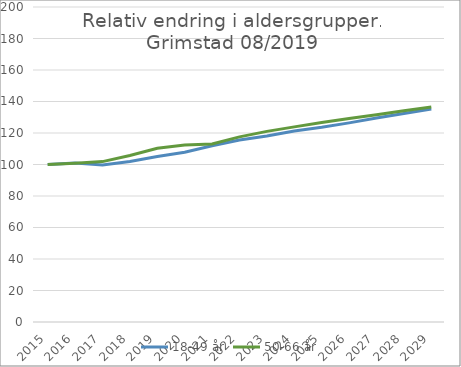
| Category | 18-49 år | 50-66 år |
|---|---|---|
| 2015.0 | 100 | 100 |
| 2016.0 | 100.934 | 100.825 |
| 2017.0 | 99.714 | 101.831 |
| 2018.0 | 101.895 | 105.703 |
| 2019.0 | 105.13 | 110.284 |
| 2020.0 | 107.774 | 112.351 |
| 2021.0 | 111.873 | 113.073 |
| 2022.0 | 115.555 | 117.545 |
| 2023.0 | 118.04 | 121.04 |
| 2024.0 | 121.298 | 123.881 |
| 2025.0 | 123.663 | 126.681 |
| 2026.0 | 126.42 | 129.255 |
| 2027.0 | 129.503 | 131.584 |
| 2028.0 | 132.317 | 134.154 |
| 2029.0 | 135.205 | 136.46 |